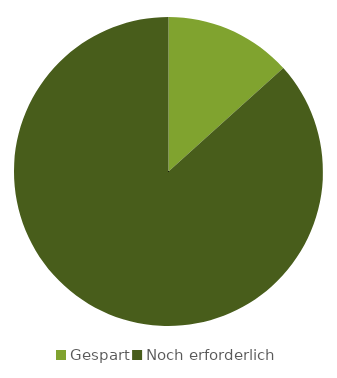
| Category | Series 0 | Series 1 |
|---|---|---|
| 0 | 200 |  |
| 1 | 1300 |  |